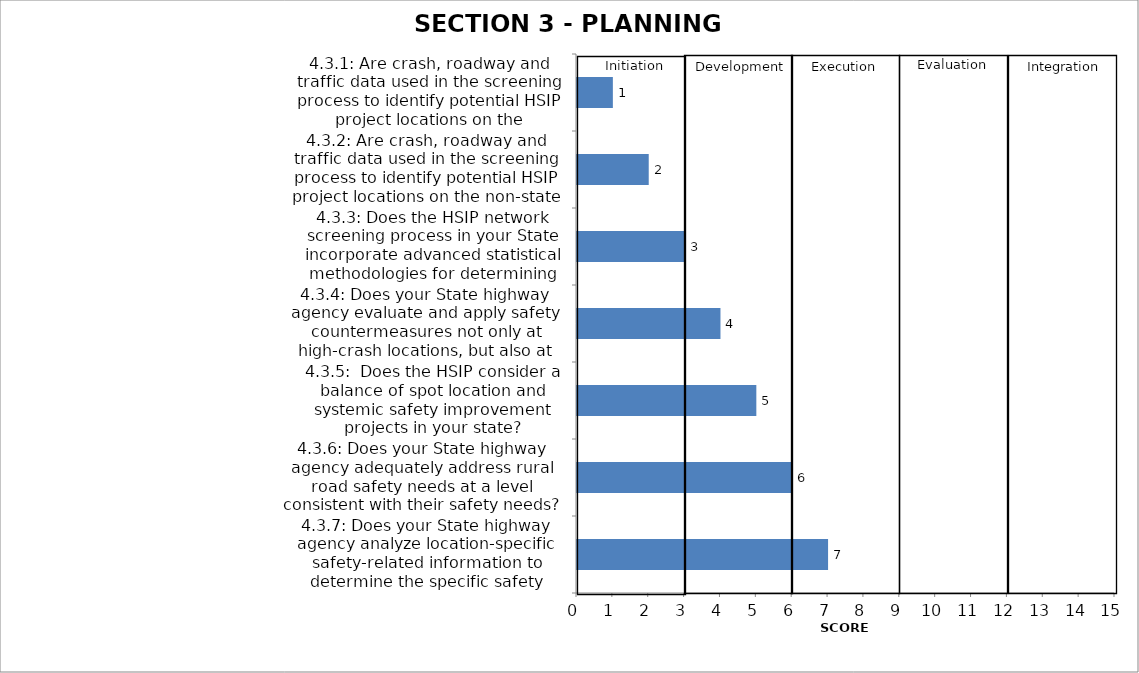
| Category | Series 0 |
|---|---|
| 4.3.1: Are crash, roadway and traffic data used in the screening process to identify potential HSIP project locations on the State-owned roadway system? | 1 |
| 4.3.2: Are crash, roadway and traffic data used in the screening process to identify potential HSIP project locations on the non-state roadway systems? | 2 |
| 4.3.3: Does the HSIP network screening process in your State incorporate advanced statistical methodologies for determining locations of need? | 3 |
| 4.3.4: Does your State highway agency evaluate and apply safety countermeasures not only at high-crash locations, but also at high-risk locations? | 4 |
| 4.3.5:  Does the HSIP consider a balance of spot location and systemic safety improvement projects in your state? | 5 |
| 4.3.6: Does your State highway agency adequately address rural road safety needs at a level consistent with their safety needs? | 6 |
| 4.3.7: Does your State highway agency analyze location-specific safety-related information to determine the specific safety concerns at potential HSIP project locations? | 7 |